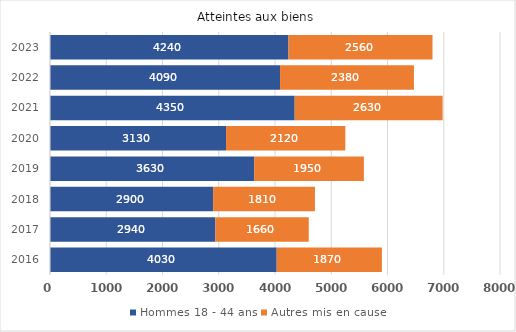
| Category | Hommes 18 - 44 ans | Autres mis en cause |
|---|---|---|
| 2016.0 | 4030 | 1870 |
| 2017.0 | 2940 | 1660 |
| 2018.0 | 2900 | 1810 |
| 2019.0 | 3630 | 1950 |
| 2020.0 | 3130 | 2120 |
| 2021.0 | 4350 | 2630 |
| 2022.0 | 4090 | 2380 |
| 2023.0 | 4240 | 2560 |